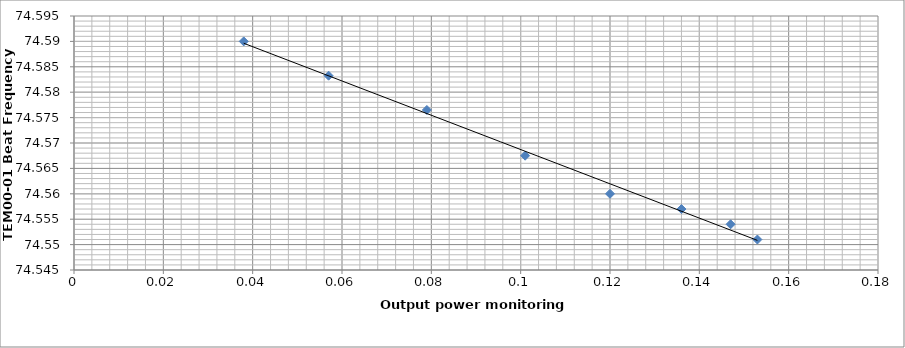
| Category | Series 0 |
|---|---|
| 0.153 | 74.551 |
| 0.147 | 74.554 |
| 0.136 | 74.557 |
| 0.12 | 74.56 |
| 0.101 | 74.568 |
| 0.079 | 74.576 |
| 0.057 | 74.583 |
| 0.038 | 74.59 |